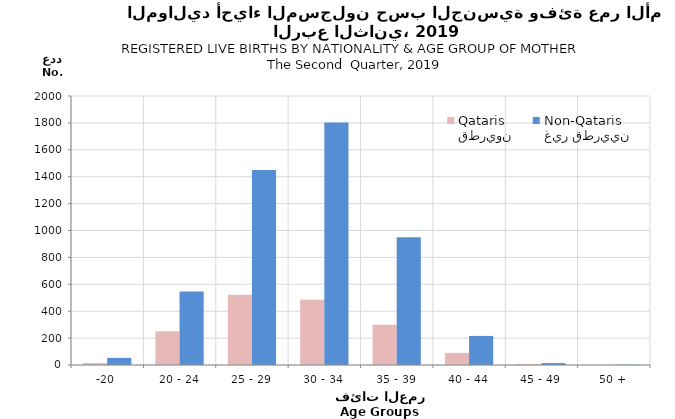
| Category | قطريون
Qataris | غير قطريين
Non-Qataris |
|---|---|---|
| -20 | 15 | 53 |
| 20 - 24 | 250 | 547 |
| 25 - 29 | 522 | 1450 |
| 30 - 34 | 485 | 1803 |
| 35 - 39 | 299 | 950 |
| 40 - 44 | 90 | 216 |
| 45 - 49 | 7 | 14 |
| 50 + | 0 | 2 |